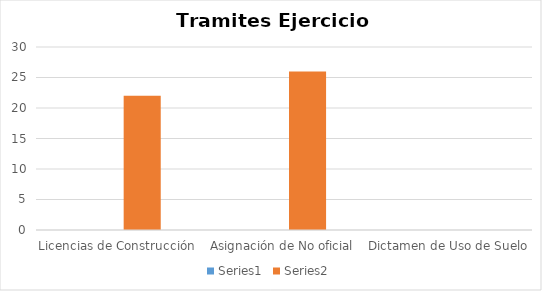
| Category | Series 0 | Series 1 |
|---|---|---|
| Licencias de Construcción |  | 22 |
| Asignación de No oficial |  | 26 |
| Dictamen de Uso de Suelo |  | 0 |